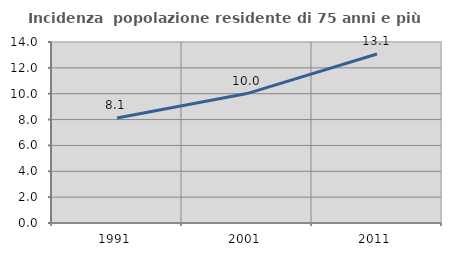
| Category | Incidenza  popolazione residente di 75 anni e più |
|---|---|
| 1991.0 | 8.127 |
| 2001.0 | 10.01 |
| 2011.0 | 13.068 |